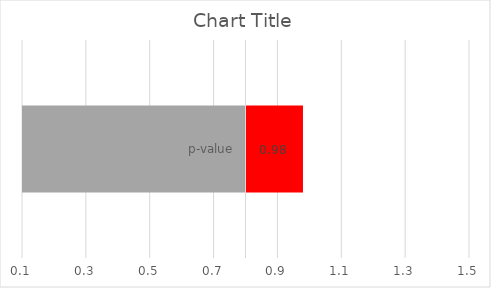
| Category | Series 2 | Series 0 | Series 1 |
|---|---|---|---|
| p-value | 0.8 | 0.18 |  |